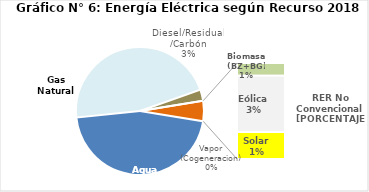
| Category | Series 0 |
|---|---|
| Agua | 2068.267 |
| Gas Natural | 2088.372 |
| Diesel/Residual/Carbón | 128.048 |
| Vapor (Cogeneracion) | 0.409 |
| Biomasa (BZ+BG) | 30.723 |
| Eólica | 135.086 |
| Solar | 65.068 |